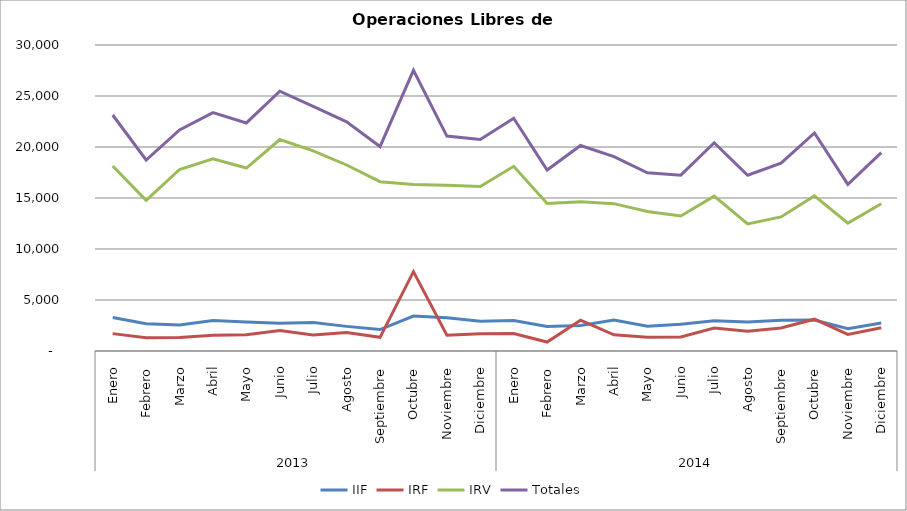
| Category | IIF | IRF | IRV | Totales |
|---|---|---|---|---|
| 0 | 3288 | 1704 | 18145 | 23137 |
| 1 | 2664.5 | 1292 | 14769 | 18725.5 |
| 2 | 2557.5 | 1316 | 17796 | 21669.5 |
| 3 | 2985.5 | 1553 | 18839 | 23377.5 |
| 4 | 2835.5 | 1583 | 17939 | 22357.5 |
| 5 | 2731 | 2007 | 20735 | 25473 |
| 6 | 2784 | 1571 | 19626 | 23981 |
| 7 | 2414 | 1816 | 18236 | 22466 |
| 8 | 2104.5 | 1342 | 16597 | 20043.5 |
| 9 | 3428.5 | 7780 | 16312 | 27520.5 |
| 10 | 3253.5 | 1556 | 16258 | 21067.5 |
| 11 | 2927 | 1693.5 | 16123 | 20743.5 |
| 12 | 2995.5 | 1721 | 18106 | 22822.5 |
| 13 | 2399 | 878.5 | 14462 | 17739.5 |
| 14 | 2511.5 | 3018 | 14621 | 20150.5 |
| 15 | 3028.5 | 1589 | 14445 | 19062.5 |
| 16 | 2432 | 1359 | 13685 | 17476 |
| 17 | 2624.5 | 1377 | 13240 | 17241.5 |
| 18 | 2969.5 | 2259 | 15185 | 20413.5 |
| 19 | 2844 | 1929 | 12454 | 17227 |
| 20 | 3016 | 2254.5 | 13143 | 18413.5 |
| 21 | 3046.5 | 3119 | 15210 | 21375.5 |
| 22 | 2175 | 1629 | 12537 | 16341 |
| 23 | 2740 | 2276 | 14436 | 19452 |